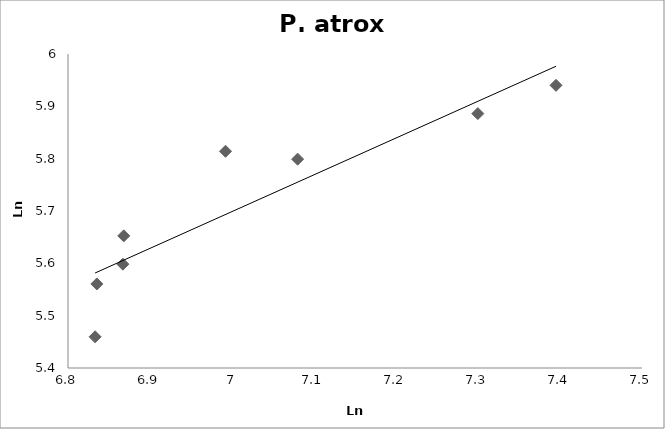
| Category | Series 0 |
|---|---|
| 7.08002649992259 | 5.799 |
| 7.395107546562485 | 5.94 |
| 6.992096427415888 | 5.814 |
| 6.866933284461882 | 5.598 |
| 6.867974408970292 | 5.652 |
| 7.29979736675816 | 5.886 |
| 6.833031732786201 | 5.46 |
| 6.835184586147301 | 5.561 |